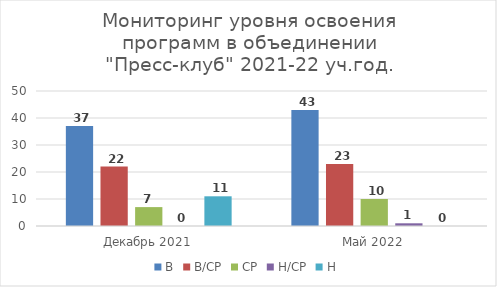
| Category | В | В/СР | СР | Н/СР | Н |
|---|---|---|---|---|---|
| Декабрь 2021 | 37 | 22 | 7 | 0 | 11 |
| Май 2022 | 43 | 23 | 10 | 1 | 0 |